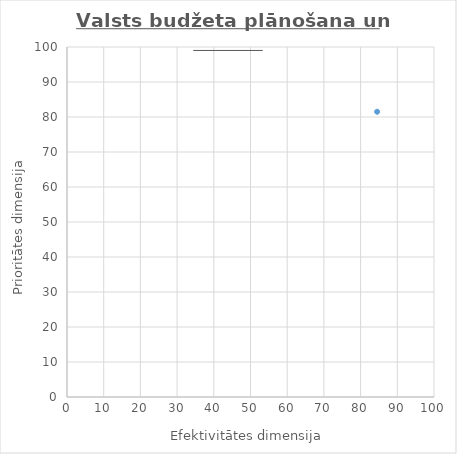
| Category | Series 0 |
|---|---|
| 84.5 | 81.5 |